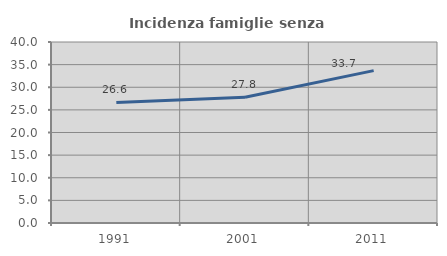
| Category | Incidenza famiglie senza nuclei |
|---|---|
| 1991.0 | 26.638 |
| 2001.0 | 27.774 |
| 2011.0 | 33.674 |